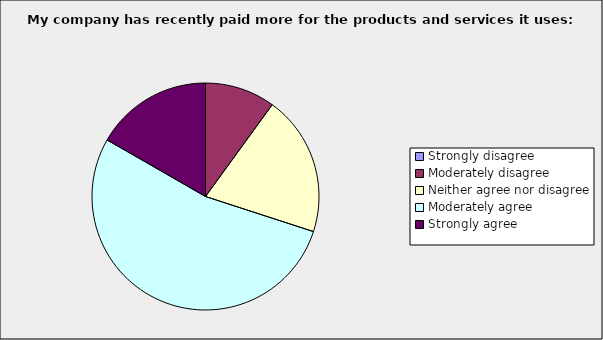
| Category | Series 0 |
|---|---|
| Strongly disagree | 0 |
| Moderately disagree | 0.1 |
| Neither agree nor disagree | 0.2 |
| Moderately agree | 0.533 |
| Strongly agree | 0.167 |